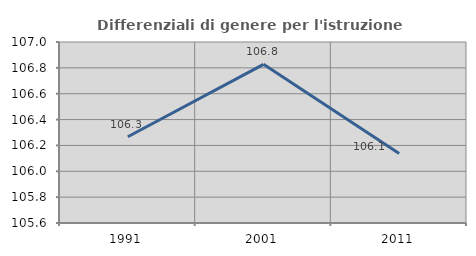
| Category | Differenziali di genere per l'istruzione superiore |
|---|---|
| 1991.0 | 106.267 |
| 2001.0 | 106.827 |
| 2011.0 | 106.138 |